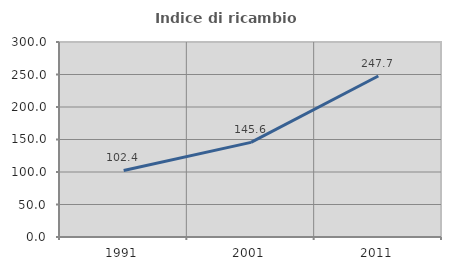
| Category | Indice di ricambio occupazionale  |
|---|---|
| 1991.0 | 102.429 |
| 2001.0 | 145.562 |
| 2011.0 | 247.712 |